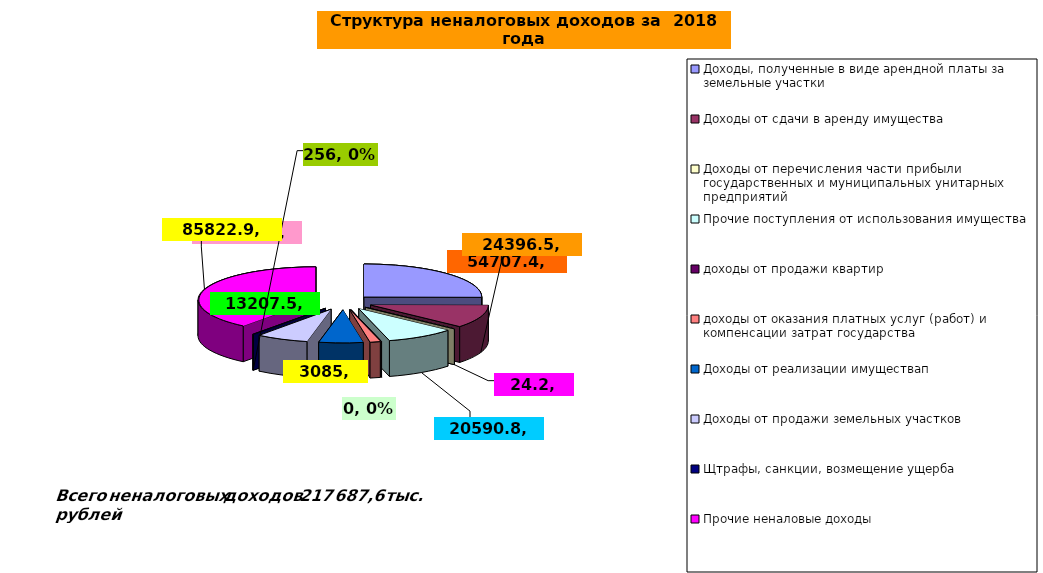
| Category | неналоговые доходы |
|---|---|
| Доходы, полученные в виде арендной платы за земельные участки | 54707.4 |
| Доходы от сдачи в аренду имущества | 24396.5 |
| Доходы от перечисления части прибыли государственных и муниципальных унитарных предприятий | 24.2 |
| Прочие поступления от использования имущества | 20590.8 |
| доходы от продажи квартир | 0 |
| доходы от оказания платных услуг (работ) и компенсации затрат государства | 3085 |
| Доходы от реализации имуществап | 13207.5 |
| Доходы от продажи земельных участков | 15597.3 |
| Щтрафы, санкции, возмещение ущерба | 256 |
| Прочие неналовые доходы | 85822.9 |